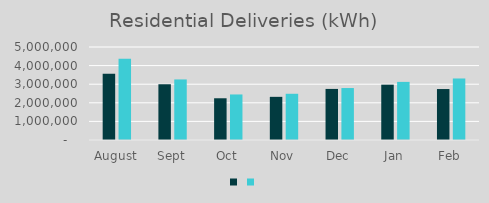
| Category | Series 1 | Series 0 |
|---|---|---|
| August | 3564883 | 4364840 |
| Sept | 2997393 | 3255766 |
| Oct | 2243531 | 2448610 |
| Nov | 2320465 | 2484917 |
| Dec | 2746090 | 2793607 |
| Jan | 2975165 | 3124442 |
| Feb | 2739688 | 3307618 |